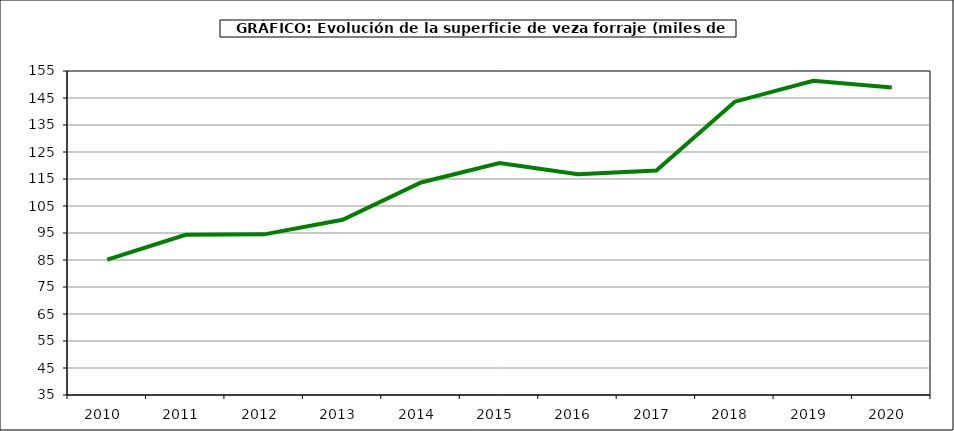
| Category | Superficie |
|---|---|
| 2010.0 | 85.154 |
| 2011.0 | 94.325 |
| 2012.0 | 94.499 |
| 2013.0 | 99.877 |
| 2014.0 | 113.725 |
| 2015.0 | 120.903 |
| 2016.0 | 116.796 |
| 2017.0 | 118.119 |
| 2018.0 | 143.634 |
| 2019.0 | 151.404 |
| 2020.0 | 148.924 |